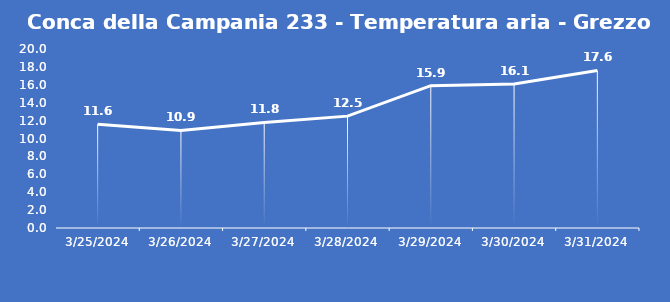
| Category | Conca della Campania 233 - Temperatura aria - Grezzo (°C) |
|---|---|
| 3/25/24 | 11.6 |
| 3/26/24 | 10.9 |
| 3/27/24 | 11.8 |
| 3/28/24 | 12.5 |
| 3/29/24 | 15.9 |
| 3/30/24 | 16.1 |
| 3/31/24 | 17.6 |